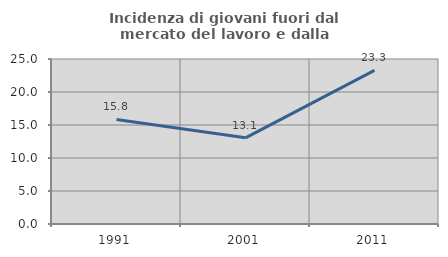
| Category | Incidenza di giovani fuori dal mercato del lavoro e dalla formazione  |
|---|---|
| 1991.0 | 15.837 |
| 2001.0 | 13.056 |
| 2011.0 | 23.276 |